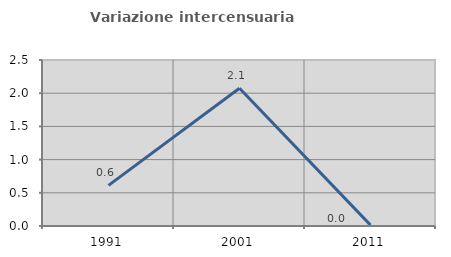
| Category | Variazione intercensuaria annua |
|---|---|
| 1991.0 | 0.612 |
| 2001.0 | 2.074 |
| 2011.0 | 0.013 |